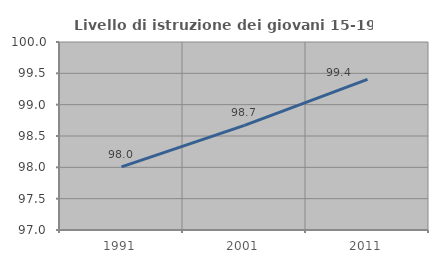
| Category | Livello di istruzione dei giovani 15-19 anni |
|---|---|
| 1991.0 | 98.009 |
| 2001.0 | 98.67 |
| 2011.0 | 99.404 |